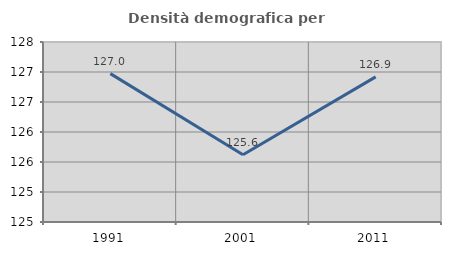
| Category | Densità demografica |
|---|---|
| 1991.0 | 126.973 |
| 2001.0 | 125.621 |
| 2011.0 | 126.919 |